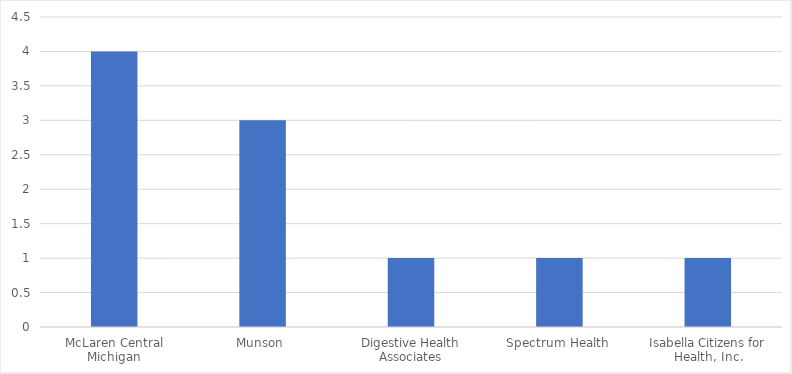
| Category | Number of Responses |
|---|---|
| McLaren Central Michigan | 4 |
| Munson  | 3 |
| Digestive Health Associates | 1 |
| Spectrum Health | 1 |
| Isabella Citizens for Health, Inc. | 1 |